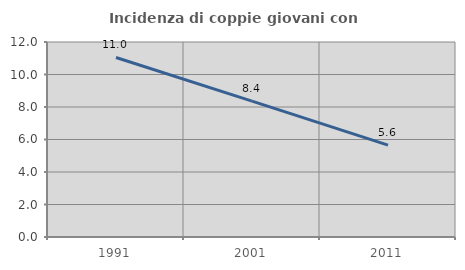
| Category | Incidenza di coppie giovani con figli |
|---|---|
| 1991.0 | 11.049 |
| 2001.0 | 8.365 |
| 2011.0 | 5.65 |